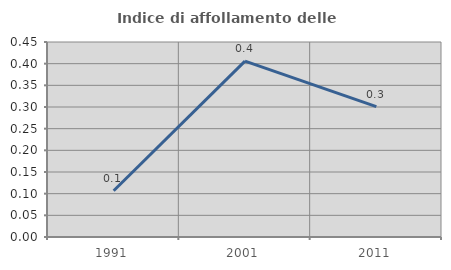
| Category | Indice di affollamento delle abitazioni  |
|---|---|
| 1991.0 | 0.107 |
| 2001.0 | 0.406 |
| 2011.0 | 0.301 |